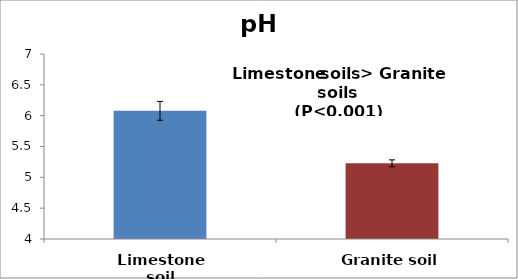
| Category | pH |
|---|---|
| Limestone soil | 6.079 |
| Granite soil | 5.227 |